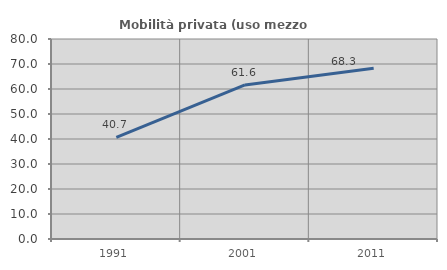
| Category | Mobilità privata (uso mezzo privato) |
|---|---|
| 1991.0 | 40.689 |
| 2001.0 | 61.637 |
| 2011.0 | 68.289 |